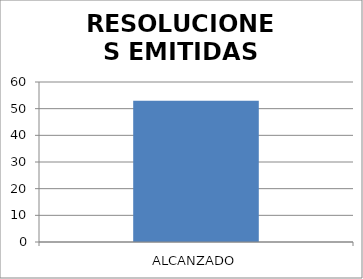
| Category | RESOLUCIONES EMITIDAS DSR |
|---|---|
| ALCANZADO | 53 |